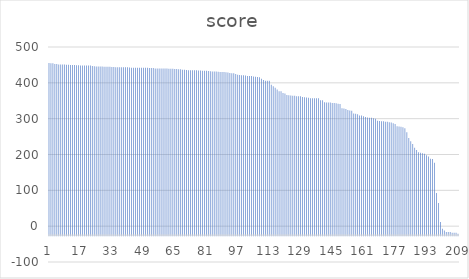
| Category | score |
|---|---|
| 0 | 455.3 |
| 1 | 454.9 |
| 2 | 454.6 |
| 3 | 452.8 |
| 4 | 452.6 |
| 5 | 451.5 |
| 6 | 451.5 |
| 7 | 451.5 |
| 8 | 451 |
| 9 | 450.8 |
| 10 | 450.8 |
| 11 | 449.9 |
| 12 | 449.8 |
| 13 | 449.5 |
| 14 | 449 |
| 15 | 448.8 |
| 16 | 448.7 |
| 17 | 448.6 |
| 18 | 448.6 |
| 19 | 448.5 |
| 20 | 448.5 |
| 21 | 448.3 |
| 22 | 447 |
| 23 | 446.5 |
| 24 | 445.8 |
| 25 | 445.7 |
| 26 | 445.7 |
| 27 | 445.3 |
| 28 | 444.7 |
| 29 | 444.7 |
| 30 | 444.7 |
| 31 | 444.7 |
| 32 | 444.4 |
| 33 | 443.9 |
| 34 | 443.8 |
| 35 | 443.6 |
| 36 | 443.5 |
| 37 | 443.5 |
| 38 | 443.5 |
| 39 | 443.5 |
| 40 | 443.5 |
| 41 | 442.5 |
| 42 | 442.4 |
| 43 | 442.4 |
| 44 | 442.4 |
| 45 | 442.2 |
| 46 | 442.1 |
| 47 | 441.9 |
| 48 | 441.9 |
| 49 | 441.9 |
| 50 | 441.8 |
| 51 | 441.6 |
| 52 | 441.5 |
| 53 | 441.4 |
| 54 | 440.3 |
| 55 | 440.3 |
| 56 | 440.2 |
| 57 | 440.2 |
| 58 | 440 |
| 59 | 440 |
| 60 | 440 |
| 61 | 439.4 |
| 62 | 439.1 |
| 63 | 439.1 |
| 64 | 438.8 |
| 65 | 438.3 |
| 66 | 437.9 |
| 67 | 437.6 |
| 68 | 436.5 |
| 69 | 436.4 |
| 70 | 436.1 |
| 71 | 435.2 |
| 72 | 435.1 |
| 73 | 434.9 |
| 74 | 434.8 |
| 75 | 434.8 |
| 76 | 434.6 |
| 77 | 434.1 |
| 78 | 433.8 |
| 79 | 433.6 |
| 80 | 433.5 |
| 81 | 433.2 |
| 82 | 432.3 |
| 83 | 431.9 |
| 84 | 431.4 |
| 85 | 431.4 |
| 86 | 430.6 |
| 87 | 430.3 |
| 88 | 430.3 |
| 89 | 429.9 |
| 90 | 429.6 |
| 91 | 428.7 |
| 92 | 427.6 |
| 93 | 426.5 |
| 94 | 426.5 |
| 95 | 424.7 |
| 96 | 422.4 |
| 97 | 422.1 |
| 98 | 421.5 |
| 99 | 421.4 |
| 100 | 420.6 |
| 101 | 419 |
| 102 | 419 |
| 103 | 419 |
| 104 | 417.5 |
| 105 | 417.3 |
| 106 | 416 |
| 107 | 415.9 |
| 108 | 411.2 |
| 109 | 407.9 |
| 110 | 405.6 |
| 111 | 405.6 |
| 112 | 405.6 |
| 113 | 394.4 |
| 114 | 390.3 |
| 115 | 386.4 |
| 116 | 381.3 |
| 117 | 376.6 |
| 118 | 376.4 |
| 119 | 371.4 |
| 120 | 370.1 |
| 121 | 366 |
| 122 | 365.4 |
| 123 | 364.4 |
| 124 | 364.2 |
| 125 | 363.8 |
| 126 | 362.6 |
| 127 | 362.3 |
| 128 | 362.3 |
| 129 | 360.5 |
| 130 | 359.6 |
| 131 | 359.1 |
| 132 | 358.2 |
| 133 | 357 |
| 134 | 357 |
| 135 | 357 |
| 136 | 357 |
| 137 | 357 |
| 138 | 351.5 |
| 139 | 351.5 |
| 140 | 346.1 |
| 141 | 345.4 |
| 142 | 344.8 |
| 143 | 344.8 |
| 144 | 344 |
| 145 | 343.9 |
| 146 | 343.1 |
| 147 | 341.9 |
| 148 | 340.6 |
| 149 | 329.2 |
| 150 | 328.4 |
| 151 | 326.8 |
| 152 | 323.9 |
| 153 | 322.5 |
| 154 | 322.2 |
| 155 | 314.5 |
| 156 | 314 |
| 157 | 312 |
| 158 | 308.8 |
| 159 | 308.5 |
| 160 | 306.6 |
| 161 | 304.8 |
| 162 | 303 |
| 163 | 302.7 |
| 164 | 302.5 |
| 165 | 301 |
| 166 | 299.8 |
| 167 | 294.2 |
| 168 | 293.3 |
| 169 | 292.5 |
| 170 | 292.5 |
| 171 | 291.4 |
| 172 | 291.3 |
| 173 | 289.9 |
| 174 | 289.1 |
| 175 | 286.9 |
| 176 | 285.4 |
| 177 | 279.1 |
| 178 | 278 |
| 179 | 277.6 |
| 180 | 276 |
| 181 | 273.4 |
| 182 | 261.8 |
| 183 | 246 |
| 184 | 236.9 |
| 185 | 229.5 |
| 186 | 218.9 |
| 187 | 212.7 |
| 188 | 206.3 |
| 189 | 205.1 |
| 190 | 203.8 |
| 191 | 202.1 |
| 192 | 197.6 |
| 193 | 194.6 |
| 194 | 188.4 |
| 195 | 187.7 |
| 196 | 176.7 |
| 197 | 92.8 |
| 198 | 64.6 |
| 199 | 11.8 |
| 200 | -7.5 |
| 201 | -12.2 |
| 202 | -16.2 |
| 203 | -16.2 |
| 204 | -16.4 |
| 205 | -18.2 |
| 206 | -18.2 |
| 207 | -18.3 |
| 208 | -21.2 |